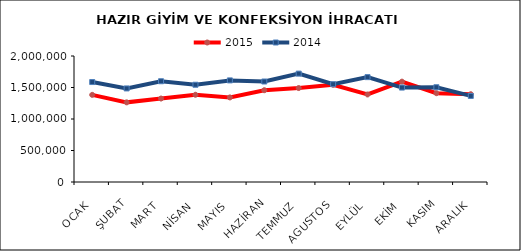
| Category | 2015 | 2014 |
|---|---|---|
| OCAK | 1383319.074 | 1586669.029 |
| ŞUBAT | 1264233.209 | 1485297.439 |
| MART | 1324731.475 | 1599259.823 |
| NİSAN | 1384804.023 | 1543767.847 |
| MAYIS | 1342615.311 | 1612655.017 |
| HAZİRAN | 1456970.053 | 1595069.61 |
| TEMMUZ | 1491271.34 | 1720098.92 |
| AGUSTOS | 1542685.893 | 1552579.153 |
| EYLÜL | 1389429.748 | 1664535.456 |
| EKİM | 1593138.391 | 1498979.289 |
| KASIM | 1409702.097 | 1504077.734 |
| ARALIK | 1393469.07 | 1366273.626 |